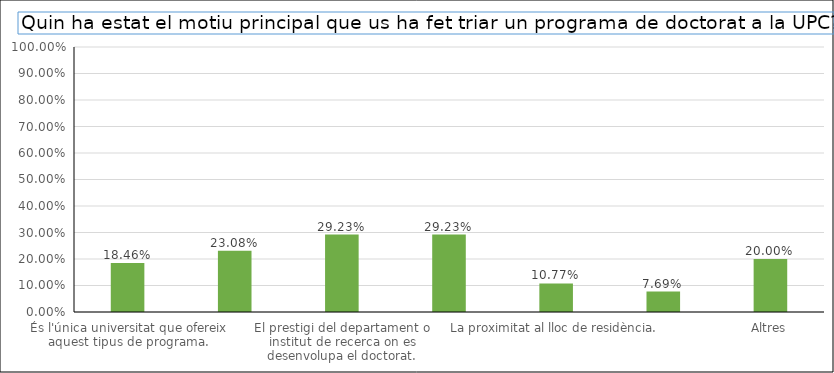
| Category | Series 0 |
|---|---|
| És l'única universitat que ofereix aquest tipus de programa. | 0.185 |
| El prestigi de la UPC. | 0.231 |
| El prestigi del departament o institut de recerca on es desenvolupa el doctorat. | 0.292 |
| El prestigi i la temàtica del grup de recerca. | 0.292 |
| La proximitat al lloc de residència. | 0.108 |
| Treballar a la UPC. | 0.077 |
| Altres | 0.2 |